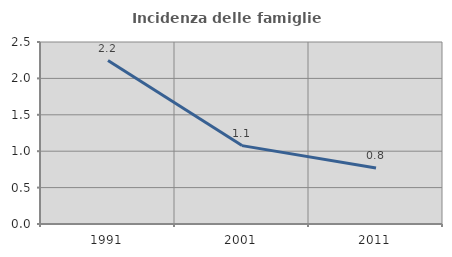
| Category | Incidenza delle famiglie numerose |
|---|---|
| 1991.0 | 2.245 |
| 2001.0 | 1.077 |
| 2011.0 | 0.77 |